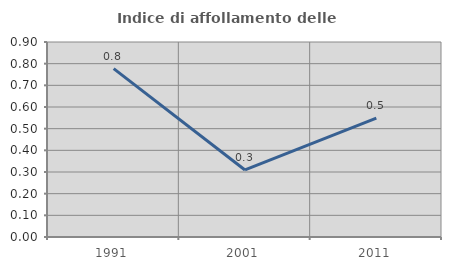
| Category | Indice di affollamento delle abitazioni  |
|---|---|
| 1991.0 | 0.777 |
| 2001.0 | 0.309 |
| 2011.0 | 0.549 |